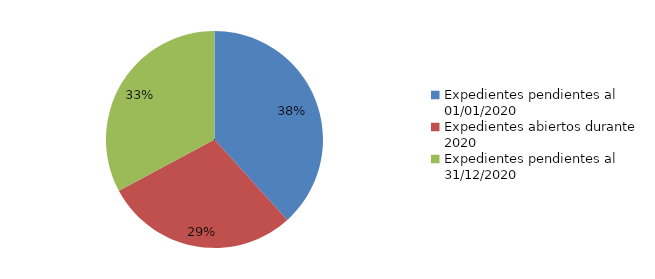
| Category | Series 0 |
|---|---|
| Expedientes pendientes al 01/01/2020 | 126 |
| Expedientes abiertos durante 2020 | 95 |
| Expedientes pendientes al 31/12/2020 | 108 |